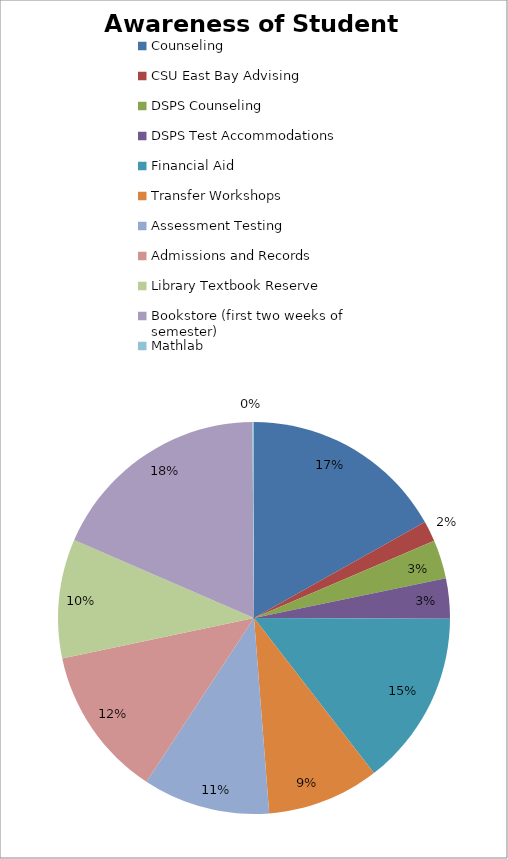
| Category | Series 0 |
|---|---|
| Counseling | 259 |
| CSU East Bay Advising | 26 |
| DSPS Counseling | 49 |
| DSPS Test Accommodations | 51 |
| Financial Aid | 222 |
| Transfer Workshops | 142 |
| Assessment Testing | 161 |
| Admissions and Records | 191 |
| Library Textbook Reserve | 151 |
| Bookstore (first two weeks of semester) | 282 |
| Mathlab | 2 |